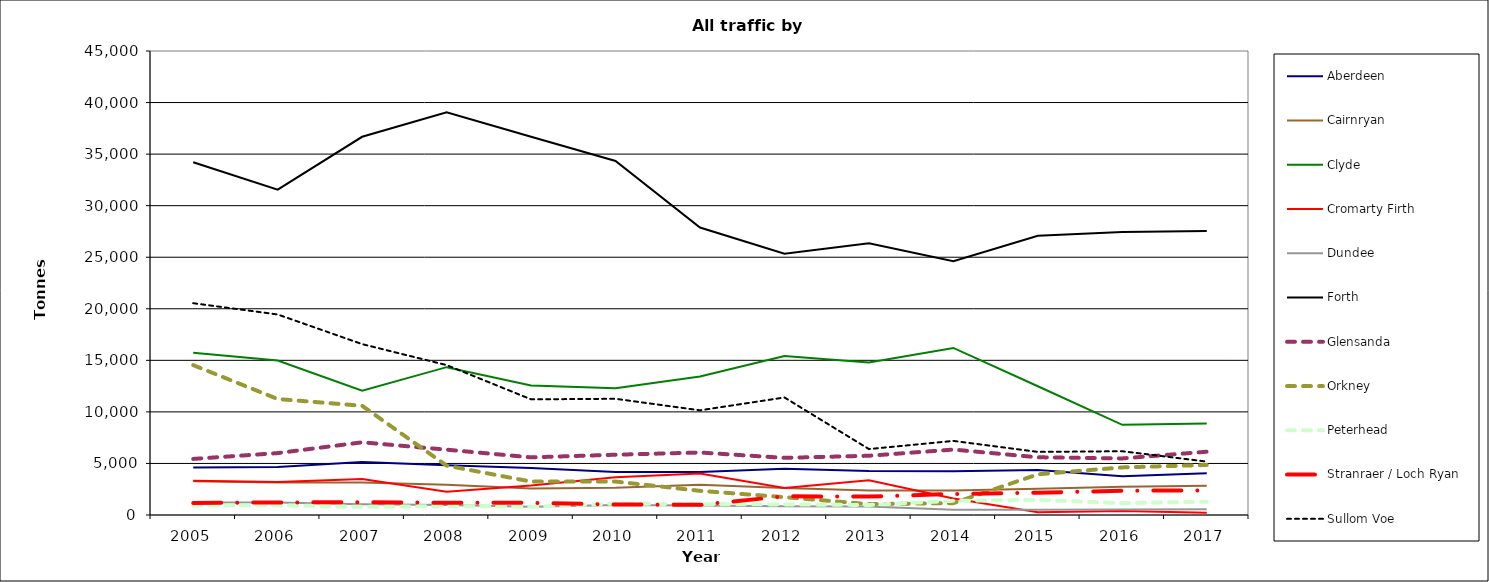
| Category | Aberdeen | Cairnryan | Clyde | Cromarty Firth | Dundee | Forth | Glensanda | Orkney | Peterhead | Stranraer / Loch Ryan | Sullom Voe |
|---|---|---|---|---|---|---|---|---|---|---|---|
| 2005.0 | 4609 | 3274 | 15737 | 3325 | 1222 | 34218 | 5439 | 14534 | 928 | 1165 | 20541 |
| 2006.0 | 4663 | 3145 | 14981 | 3206 | 1202 | 31556 | 6004 | 11249 | 947 | 1222 | 19447 |
| 2007.0 | 5131 | 3163 | 12063 | 3502 | 1035 | 36681 | 7050 | 10592 | 790 | 1231 | 16573 |
| 2008.0 | 4833 | 2928 | 14338 | 2252 | 978 | 39054 | 6336 | 4789 | 871 | 1190 | 14539 |
| 2009.0 | 4570 | 2572 | 12552 | 2864 | 810 | 36690 | 5591 | 3241 | 797 | 1177 | 11217 |
| 2010.0 | 4164 | 2634 | 12283 | 3663 | 962 | 34335 | 5846 | 3244 | 1107 | 1017 | 11270 |
| 2011.0 | 4165 | 2932 | 13431 | 4020 | 929 | 27878 | 6060 | 2344 | 1054 | 986 | 10153 |
| 2012.0 | 4493 | 2610 | 15421 | 2628 | 842 | 25332 | 5541 | 1729 | 1024 | 1815 | 11398 |
| 2013.0 | 4264 | 2365 | 14783 | 3378 | 815 | 26365 | 5746 | 1054 | 971 | 1783 | 6394 |
| 2014.0 | 4231 | 2368 | 16201 | 1591 | 517 | 24608 | 6347 | 1151 | 1377 | 2038 | 7185 |
| 2015.0 | 4375.979 | 2548.415 | 12484.055 | 261.784 | 514.908 | 27074.039 | 5597.361 | 3945.42 | 1467.652 | 2163.254 | 6119.589 |
| 2016.0 | 3770 | 2740 | 8742 | 395 | 534 | 27439 | 5487 | 4615 | 1148 | 2356 | 6183 |
| 2017.0 | 4058 | 2847 | 8865 | 227 | 566 | 27544 | 6138 | 4852 | 1288 | 2388 | 5179 |